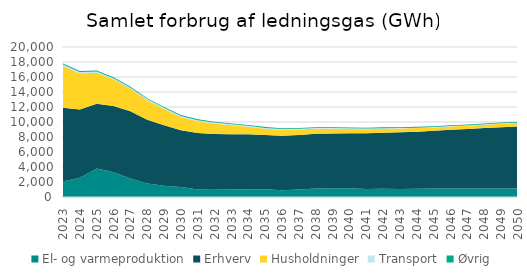
| Category | El- og varmeproduktion | Erhverv | Husholdninger | Transport | Øvrig |
|---|---|---|---|---|---|
| 2023.0 | 2067.79 | 9826.44 | 5588.73 | 170.78 | 159.69 |
| 2024.0 | 2552.97 | 9116.56 | 4816.29 | 172.55 | 148.66 |
| 2025.0 | 3786.35 | 8657.35 | 4138.4 | 160.6 | 140.05 |
| 2026.0 | 3307.81 | 8813.18 | 3564.28 | 160.45 | 136.51 |
| 2027.0 | 2459.03 | 8969.04 | 2990.17 | 159.87 | 132.98 |
| 2028.0 | 1808.08 | 8505.95 | 2582.35 | 156.97 | 127.15 |
| 2029.0 | 1514.09 | 8042.85 | 2174.52 | 155.1 | 121.33 |
| 2030.0 | 1317.38 | 7579.77 | 1766.71 | 151.15 | 115.51 |
| 2031.0 | 1009.03 | 7513.01 | 1577.19 | 145.36 | 113.87 |
| 2032.0 | 952.66 | 7446.33 | 1387.68 | 138.65 | 112.23 |
| 2033.0 | 989.14 | 7379.56 | 1198.17 | 131.27 | 110.59 |
| 2034.0 | 1038.87 | 7312.86 | 1008.65 | 123.16 | 108.95 |
| 2035.0 | 1030.03 | 7246.11 | 819.13 | 114.46 | 107.32 |
| 2036.0 | 912.88 | 7264.32 | 773.04 | 105.94 | 107.17 |
| 2037.0 | 984.71 | 7282.51 | 726.93 | 98.11 | 107.02 |
| 2038.0 | 1117.34 | 7300.72 | 680.82 | 91.04 | 106.87 |
| 2039.0 | 1154.91 | 7318.91 | 634.72 | 84.62 | 106.73 |
| 2040.0 | 1151.6 | 7337.09 | 588.61 | 78.82 | 106.58 |
| 2041.0 | 1079.77 | 7409.17 | 560.12 | 73.63 | 106.87 |
| 2042.0 | 1099.66 | 7481.21 | 531.61 | 68.94 | 107.16 |
| 2043.0 | 1078.66 | 7553.3 | 503.1 | 64.63 | 107.45 |
| 2044.0 | 1087.5 | 7625.36 | 474.61 | 60.6 | 107.74 |
| 2045.0 | 1125.08 | 7697.42 | 446.1 | 56.78 | 108.02 |
| 2046.0 | 1149.39 | 7813.71 | 452.15 | 53.09 | 108.76 |
| 2047.0 | 1129.49 | 7929.99 | 458.19 | 49.48 | 109.5 |
| 2048.0 | 1138.34 | 8046.3 | 464.22 | 45.91 | 110.24 |
| 2049.0 | 1142.76 | 8162.57 | 470.27 | 42.35 | 110.98 |
| 2050.0 | 1116.23 | 8278.86 | 476.31 | 38.76 | 111.71 |